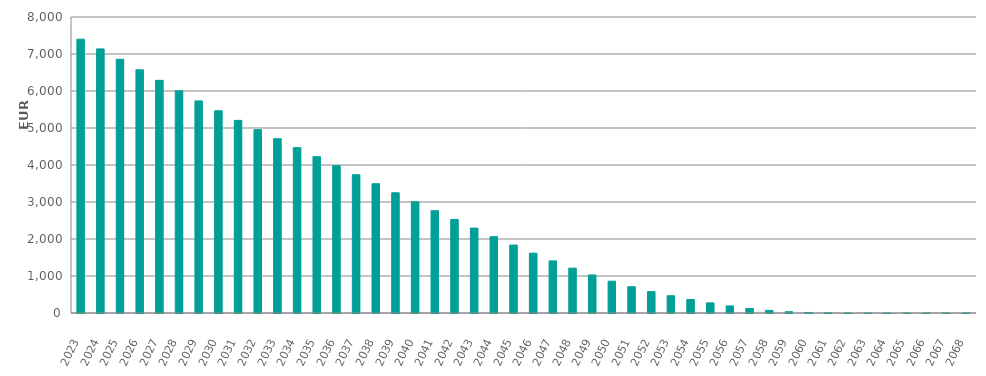
| Category | EUR Millions |
|---|---|
| 2023.0 | 7400000000.28 |
| 2024.0 | 7138390817.971 |
| 2025.0 | 6856760614.494 |
| 2026.0 | 6571934215.447 |
| 2027.0 | 6287380148.714 |
| 2028.0 | 6006096601.694 |
| 2029.0 | 5732235343.276 |
| 2030.0 | 5465551129.971 |
| 2031.0 | 5206397620.216 |
| 2032.0 | 4955522165.455 |
| 2033.0 | 4711145641.511 |
| 2034.0 | 4469164095.227 |
| 2035.0 | 4225650609.301 |
| 2036.0 | 3980961730.776 |
| 2037.0 | 3737182416.15 |
| 2038.0 | 3493836860.324 |
| 2039.0 | 3248950325.623 |
| 2040.0 | 3006234016.083 |
| 2041.0 | 2765752096.59 |
| 2042.0 | 2528897558.577 |
| 2043.0 | 2294663126.024 |
| 2044.0 | 2063071814.49 |
| 2045.0 | 1836314502.55 |
| 2046.0 | 1616854455.826 |
| 2047.0 | 1408033671.063 |
| 2048.0 | 1211760197.97 |
| 2049.0 | 1027833266.131 |
| 2050.0 | 859858069.655 |
| 2051.0 | 709721773.119 |
| 2052.0 | 578471161.825 |
| 2053.0 | 466401720.703 |
| 2054.0 | 365511593.553 |
| 2055.0 | 273228143.117 |
| 2056.0 | 190758605.37 |
| 2057.0 | 121322882.333 |
| 2058.0 | 70772344.129 |
| 2059.0 | 34847656.599 |
| 2060.0 | 14886454.639 |
| 2061.0 | 4306350.958 |
| 2062.0 | 573059.205 |
| 2063.0 | 55154.162 |
| 2064.0 | 32111.907 |
| 2065.0 | 18618.352 |
| 2066.0 | 11115.246 |
| 2067.0 | 5875.788 |
| 2068.0 | 459.522 |